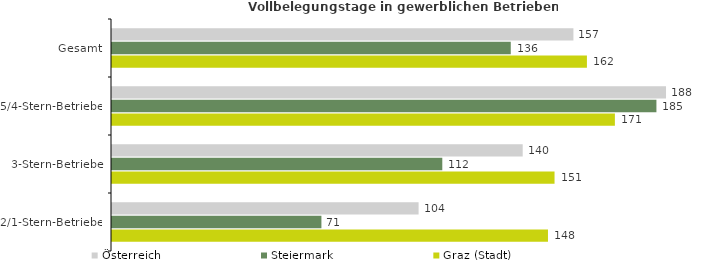
| Category | Österreich | Steiermark | Graz (Stadt) |
|---|---|---|---|
| Gesamt | 156.946 | 135.634 | 161.537 |
| 5/4-Stern-Betriebe | 188.443 | 185.178 | 171.052 |
| 3-Stern-Betriebe | 139.696 | 112.345 | 150.525 |
| 2/1-Stern-Betriebe | 104.286 | 71.229 | 148.292 |